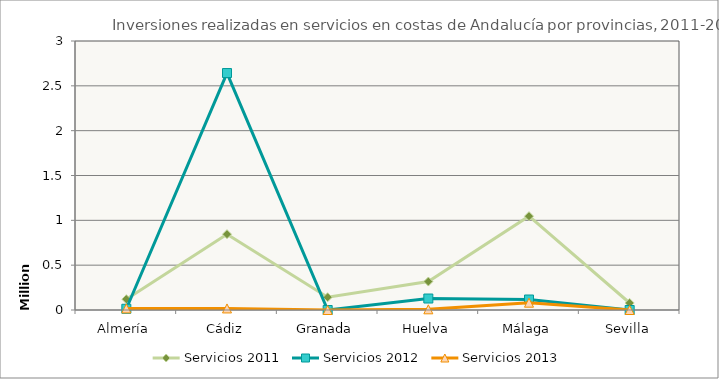
| Category | Servicios 2011 | Servicios 2012 | Servicios 2013 |
|---|---|---|---|
| Almería | 120636.12 | 13601 | 17650.21 |
| Cádiz | 845052.46 | 2642630 | 17413.9 |
| Granada | 142268 | 0 | 0 |
| Huelva | 317172.57 | 127999 | 7596.8 |
| Málaga | 1045984.47 | 117051 | 81708.1 |
| Sevilla | 78107.08 | 0 | 0 |